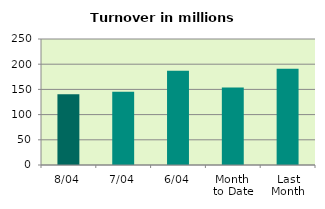
| Category | Series 0 |
|---|---|
| 8/04 | 140.231 |
| 7/04 | 145.58 |
| 6/04 | 186.801 |
| Month 
to Date | 153.836 |
| Last
Month | 190.797 |